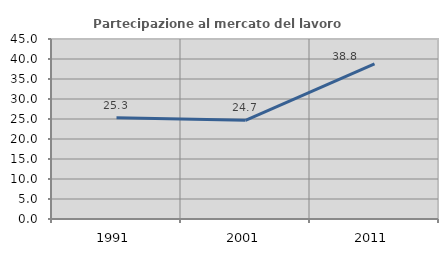
| Category | Partecipazione al mercato del lavoro  femminile |
|---|---|
| 1991.0 | 25.32 |
| 2001.0 | 24.679 |
| 2011.0 | 38.798 |